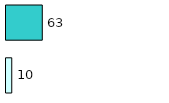
| Category | Series 0 | Series 1 |
|---|---|---|
| 0 | 10 | 63 |